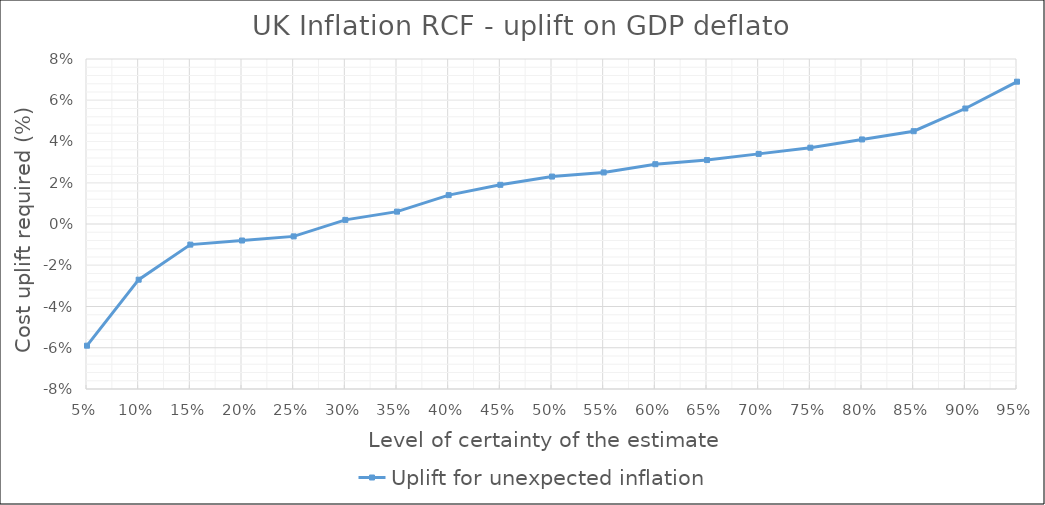
| Category | Uplift for unexpected inflation |
|---|---|
| 0.05 | -0.059 |
| 0.1 | -0.027 |
| 0.15 | -0.01 |
| 0.2 | -0.008 |
| 0.25 | -0.006 |
| 0.3 | 0.002 |
| 0.35 | 0.006 |
| 0.4 | 0.014 |
| 0.45 | 0.019 |
| 0.5 | 0.023 |
| 0.55 | 0.025 |
| 0.6 | 0.029 |
| 0.65 | 0.031 |
| 0.7 | 0.034 |
| 0.75 | 0.037 |
| 0.8 | 0.041 |
| 0.85 | 0.045 |
| 0.9 | 0.056 |
| 0.95 | 0.069 |